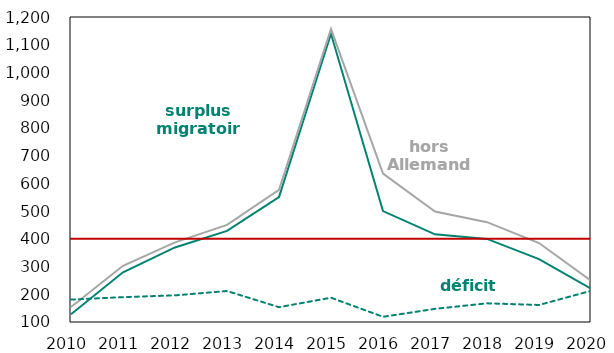
| Category | surplus migratoire | hors Allemands | déficit naturel |
|---|---|---|---|
| 2010.0 | 127.677 | 153.925 | 180.821 |
| 2011.0 | 279.33 | 302.858 | 189.643 |
| 2012.0 | 368.945 | 387.149 | 196.038 |
| 2013.0 | 428.607 | 450.464 | 211.756 |
| 2014.0 | 550.483 | 576.924 | 153.429 |
| 2015.0 | 1139.402 | 1156.962 | 187.625 |
| 2016.0 | 499.944 | 635.308 | 118.771 |
| 2017.0 | 416.08 | 498.558 | 147.388 |
| 2018.0 | 399.68 | 460 | 167.351 |
| 2019.0 | 327.06 | 384.685 | 161.43 |
| 2020.0 | 220.251 | 248.607 | 212.428 |